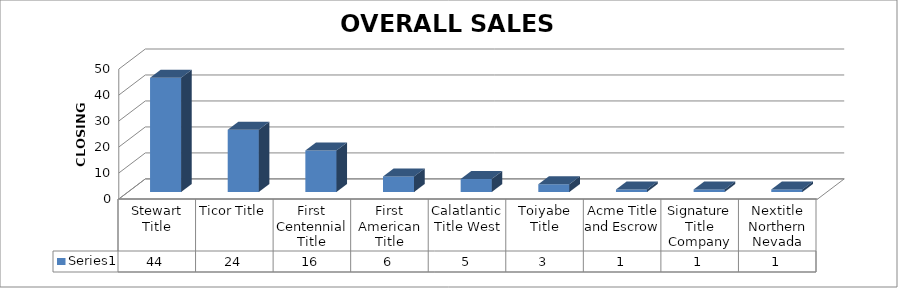
| Category | Series 0 |
|---|---|
| Stewart Title | 44 |
| Ticor Title | 24 |
| First Centennial Title | 16 |
| First American Title | 6 |
| Calatlantic Title West | 5 |
| Toiyabe Title | 3 |
| Acme Title and Escrow | 1 |
| Signature Title Company | 1 |
| Nextitle Northern Nevada | 1 |